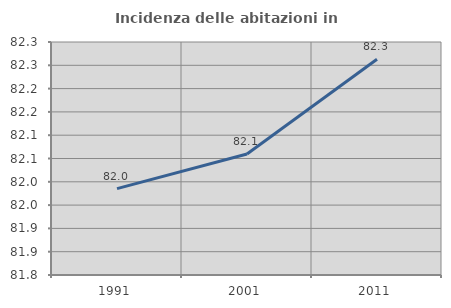
| Category | Incidenza delle abitazioni in proprietà  |
|---|---|
| 1991.0 | 81.985 |
| 2001.0 | 82.06 |
| 2011.0 | 82.263 |